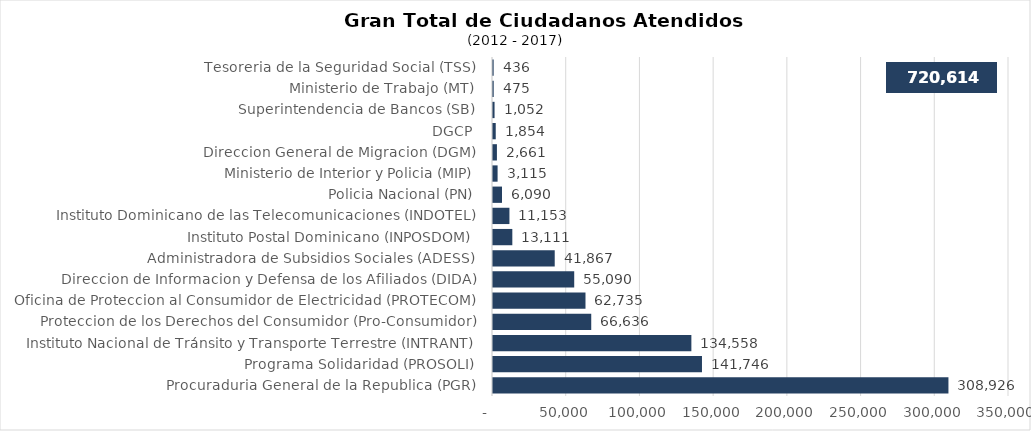
| Category | Series 0 |
|---|---|
| Procuraduria General de la Republica (PGR) | 308926 |
| Programa Solidaridad (PROSOLI) | 141746 |
| Instituto Nacional de Tránsito y Transporte Terrestre (INTRANT) | 134558 |
| Proteccion de los Derechos del Consumidor (Pro-Consumidor) | 66636 |
| Oficina de Proteccion al Consumidor de Electricidad (PROTECOM) | 62735 |
| Direccion de Informacion y Defensa de los Afiliados (DIDA) | 55090 |
| Administradora de Subsidios Sociales (ADESS) | 41867 |
| Instituto Postal Dominicano (INPOSDOM) | 13111 |
| Instituto Dominicano de las Telecomunicaciones (INDOTEL) | 11153 |
| Policia Nacional (PN) | 6090 |
| Ministerio de Interior y Policia (MIP) | 3115 |
| Direccion General de Migracion (DGM) | 2661 |
| DGCP | 1854 |
| Superintendencia de Bancos (SB) | 1052 |
| Ministerio de Trabajo (MT) | 475 |
| Tesoreria de la Seguridad Social (TSS) | 436 |